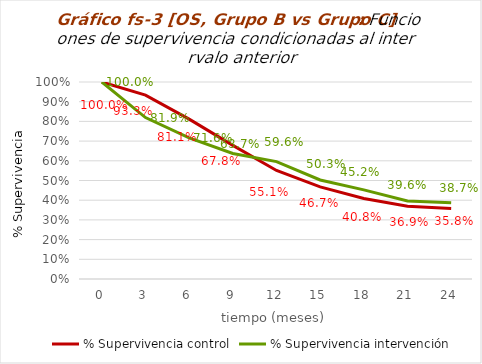
| Category | % Supervivencia control | % Supervivencia intervención |
|---|---|---|
| 0.0 | 1 | 1 |
| 3.0 | 0.933 | 0.819 |
| 6.0 | 0.811 | 0.716 |
| 9.0 | 0.678 | 0.637 |
| 12.0 | 0.551 | 0.596 |
| 15.0 | 0.467 | 0.503 |
| 18.0 | 0.408 | 0.452 |
| 21.0 | 0.369 | 0.396 |
| 24.0 | 0.358 | 0.387 |